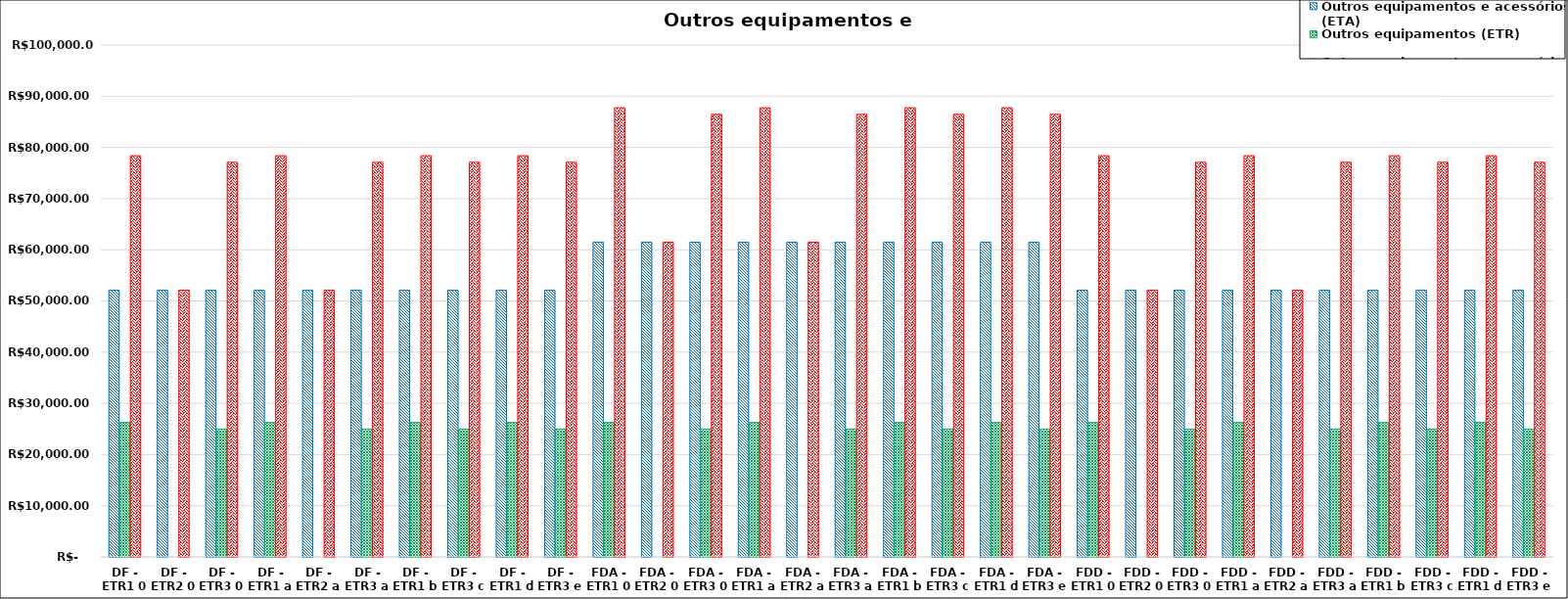
| Category | Outros equipamentos e acessórios (ETA) | Outros equipamentos (ETR) | Outros equipamentos e acessórios (total) |
|---|---|---|---|
| DF - ETR1 0 | 52115.45 | 26256.23 | 78371.68 |
| DF - ETR2 0 | 52115.45 | 0 | 52115.45 |
| DF - ETR3 0 | 52115.45 | 24977.93 | 77093.38 |
| DF - ETR1 a | 52115.45 | 26256.23 | 78371.68 |
| DF - ETR2 a | 52115.45 | 0 | 52115.45 |
| DF - ETR3 a | 52115.45 | 24977.93 | 77093.38 |
| DF - ETR1 b | 52115.45 | 26256.23 | 78371.68 |
| DF - ETR3 c | 52115.45 | 24977.93 | 77093.38 |
| DF - ETR1 d | 52115.45 | 26256.23 | 78371.68 |
| DF - ETR3 e | 52115.45 | 24977.93 | 77093.38 |
| FDA - ETR1 0 | 61479.63 | 26256.23 | 87735.86 |
| FDA - ETR2 0 | 61479.63 | 0 | 61479.63 |
| FDA - ETR3 0 | 61479.63 | 24977.93 | 86457.56 |
| FDA - ETR1 a | 61479.63 | 26256.23 | 87735.86 |
| FDA - ETR2 a | 61479.63 | 0 | 61479.63 |
| FDA - ETR3 a | 61479.63 | 24977.93 | 86457.56 |
| FDA - ETR1 b | 61479.63 | 26256.23 | 87735.86 |
| FDA - ETR3 c | 61479.63 | 24977.93 | 86457.56 |
| FDA - ETR1 d | 61479.63 | 26256.23 | 87735.86 |
| FDA - ETR3 e | 61479.63 | 24977.93 | 86457.56 |
| FDD - ETR1 0 | 52115.45 | 26256.23 | 78371.68 |
| FDD - ETR2 0 | 52115.45 | 0 | 52115.45 |
| FDD - ETR3 0 | 52115.45 | 24977.93 | 77093.38 |
| FDD - ETR1 a | 52115.45 | 26256.23 | 78371.68 |
| FDD - ETR2 a | 52115.45 | 0 | 52115.45 |
| FDD - ETR3 a | 52115.45 | 24977.93 | 77093.38 |
| FDD - ETR1 b | 52115.45 | 26256.23 | 78371.68 |
| FDD - ETR3 c | 52115.45 | 24977.93 | 77093.38 |
| FDD - ETR1 d | 52115.45 | 26256.23 | 78371.68 |
| FDD - ETR3 e | 52115.45 | 24977.93 | 77093.38 |